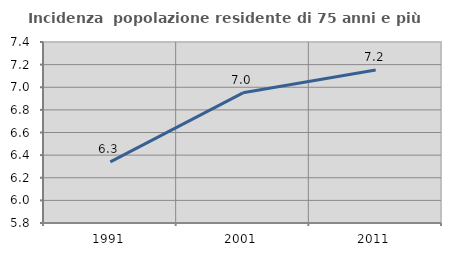
| Category | Incidenza  popolazione residente di 75 anni e più |
|---|---|
| 1991.0 | 6.341 |
| 2001.0 | 6.951 |
| 2011.0 | 7.152 |